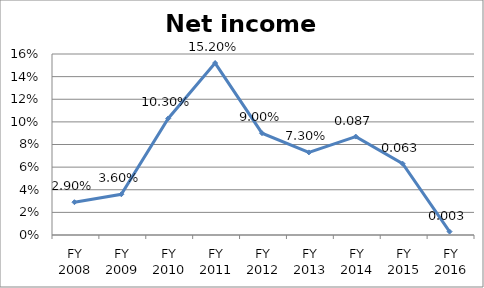
| Category | Net income ratio |
|---|---|
| FY 2016 | 0.003 |
| FY 2015 | 0.063 |
| FY 2014 | 0.087 |
| FY 2013 | 0.073 |
| FY 2012 | 0.09 |
| FY 2011 | 0.152 |
| FY 2010 | 0.103 |
| FY 2009 | 0.036 |
| FY 2008 | 0.029 |